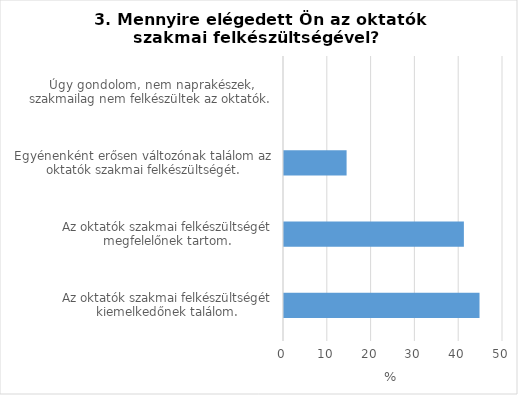
| Category | Series 0 |
|---|---|
| Az oktatók szakmai felkészültségét kiemelkedőnek találom. | 44.64 |
| Az oktatók szakmai felkészültségét megfelelőnek tartom. | 41.07 |
| Egyénenként erősen változónak találom az oktatók szakmai felkészültségét. | 14.29 |
| Úgy gondolom, nem naprakészek, szakmailag nem felkészültek az oktatók. | 0 |